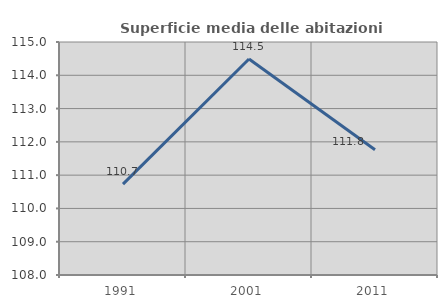
| Category | Superficie media delle abitazioni occupate |
|---|---|
| 1991.0 | 110.731 |
| 2001.0 | 114.489 |
| 2011.0 | 111.763 |